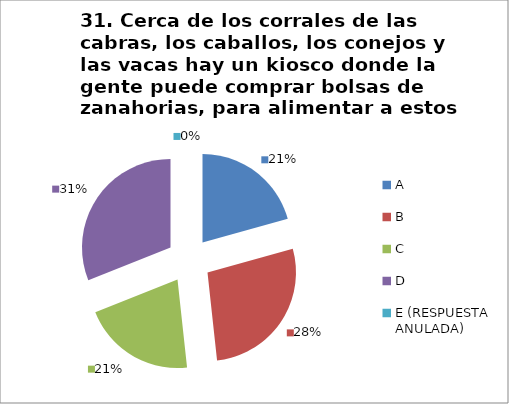
| Category | CANTIDAD DE RESPUESTAS PREGUNTA (31) | PORCENTAJE |
|---|---|---|
| A | 6 | 0.207 |
| B | 8 | 0.276 |
| C | 6 | 0.207 |
| D | 9 | 0.31 |
| E (RESPUESTA ANULADA) | 0 | 0 |